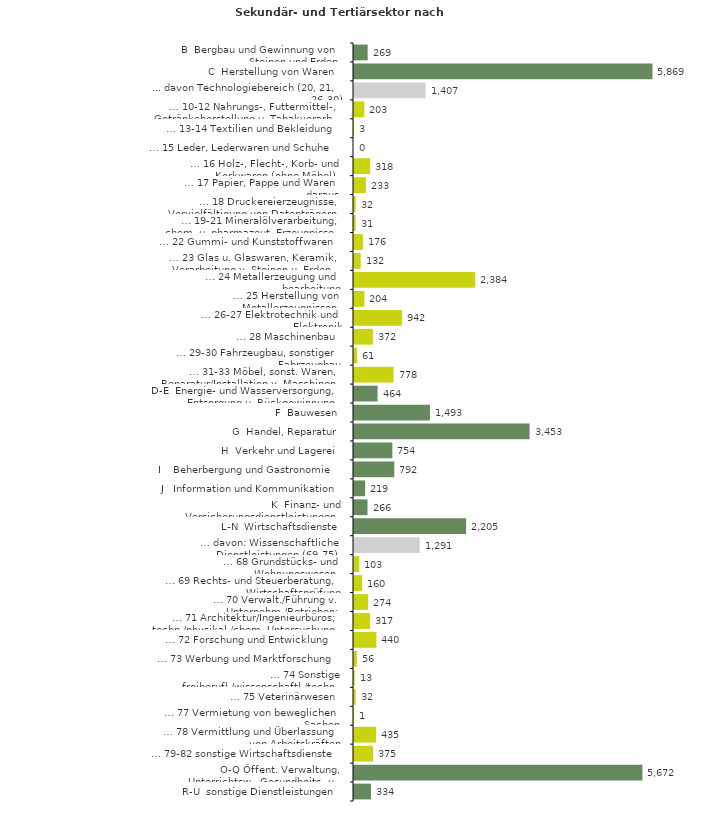
| Category | Series 0 |
|---|---|
| B  Bergbau und Gewinnung von Steinen und Erden | 269 |
| C  Herstellung von Waren | 5869 |
| ... davon Technologiebereich (20, 21, 26-30) | 1407 |
| … 10-12 Nahrungs-, Futtermittel-, Getränkeherstellung u. Tabakverarb. | 203 |
| … 13-14 Textilien und Bekleidung | 3 |
| … 15 Leder, Lederwaren und Schuhe | 0 |
| … 16 Holz-, Flecht-, Korb- und Korkwaren (ohne Möbel)  | 318 |
| … 17 Papier, Pappe und Waren daraus  | 233 |
| … 18 Druckereierzeugnisse, Vervielfältigung von Datenträgern | 32 |
| … 19-21 Mineralölverarbeitung, chem. u. pharmazeut. Erzeugnisse | 31 |
| … 22 Gummi- und Kunststoffwaren | 176 |
| … 23 Glas u. Glaswaren, Keramik, Verarbeitung v. Steinen u. Erden  | 132 |
| … 24 Metallerzeugung und -bearbeitung | 2384 |
| … 25 Herstellung von Metallerzeugnissen  | 204 |
| … 26-27 Elektrotechnik und Elektronik | 942 |
| … 28 Maschinenbau | 372 |
| … 29-30 Fahrzeugbau, sonstiger Fahrzeugbau | 61 |
| … 31-33 Möbel, sonst. Waren, Reparatur/Installation v. Maschinen | 778 |
| D-E  Energie- und Wasserversorgung, Entsorgung u. Rückgewinnung | 464 |
| F  Bauwesen | 1493 |
| G  Handel, Reparatur | 3453 |
| H  Verkehr und Lagerei | 754 |
| I    Beherbergung und Gastronomie | 792 |
| J   Information und Kommunikation | 219 |
| K  Finanz- und Versicherungsdienstleistungen | 266 |
| L-N  Wirtschaftsdienste | 2205 |
| … davon: Wissenschaftliche Dienstleistungen (69-75) | 1291 |
| … 68 Grundstücks- und Wohnungswesen  | 103 |
| … 69 Rechts- und Steuerberatung, Wirtschaftsprüfung | 160 |
| … 70 Verwalt./Führung v. Unternehm./Betrieben; Unternehmensberat. | 274 |
| … 71 Architektur/Ingenieurbüros; techn./physikal./chem. Untersuchung | 317 |
| … 72 Forschung und Entwicklung  | 440 |
| … 73 Werbung und Marktforschung | 56 |
| … 74 Sonstige freiberufl./wissenschaftl./techn. Tätigkeiten | 13 |
| … 75 Veterinärwesen | 32 |
| … 77 Vermietung von beweglichen Sachen  | 1 |
| … 78 Vermittlung und Überlassung von Arbeitskräften | 435 |
| … 79-82 sonstige Wirtschaftsdienste | 375 |
| O-Q Öffent. Verwaltung, Unterrichtsw., Gesundheits- u. Sozialwesen | 5672 |
| R-U  sonstige Dienstleistungen | 334 |